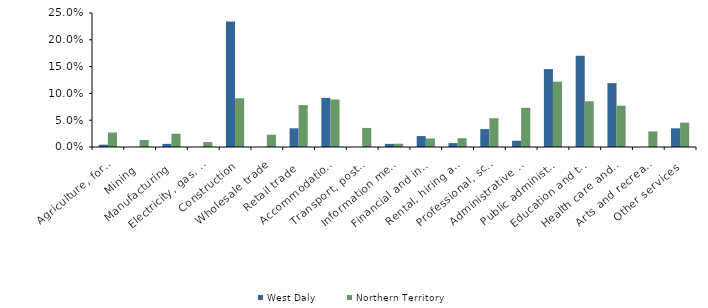
| Category | West Daly | Northern Territory |
|---|---|---|
| Agriculture, forestry and fishing | 0.004 | 0.027 |
| Mining | 0 | 0.013 |
| Manufacturing | 0.006 | 0.025 |
| Electricity, gas, water and waste services | 0 | 0.009 |
| Construction | 0.234 | 0.091 |
| Wholesale trade | 0 | 0.023 |
| Retail trade | 0.035 | 0.078 |
| Accommodation and food services | 0.092 | 0.089 |
| Transport, postal and warehousing | 0 | 0.036 |
| Information media and telecommunications | 0.006 | 0.006 |
| Financial and insurance services | 0.02 | 0.016 |
| Rental, hiring and real estate services | 0.007 | 0.016 |
| Professional, scientific and technical services | 0.033 | 0.054 |
| Administrative and support services | 0.012 | 0.073 |
| Public administration and safety | 0.145 | 0.122 |
| Education and training | 0.17 | 0.085 |
| Health care and social assistance | 0.119 | 0.077 |
| Arts and recreation services | 0 | 0.029 |
| Other services | 0.035 | 0.045 |